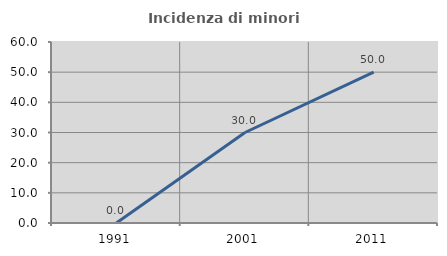
| Category | Incidenza di minori stranieri |
|---|---|
| 1991.0 | 0 |
| 2001.0 | 30 |
| 2011.0 | 50 |